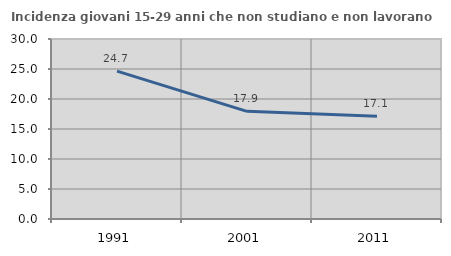
| Category | Incidenza giovani 15-29 anni che non studiano e non lavorano  |
|---|---|
| 1991.0 | 24.652 |
| 2001.0 | 17.942 |
| 2011.0 | 17.126 |